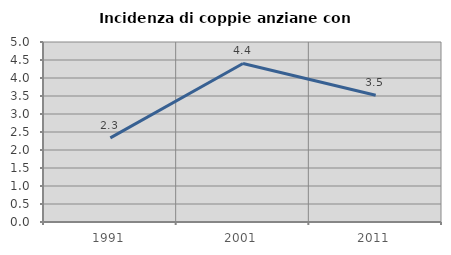
| Category | Incidenza di coppie anziane con figli |
|---|---|
| 1991.0 | 2.338 |
| 2001.0 | 4.404 |
| 2011.0 | 3.521 |